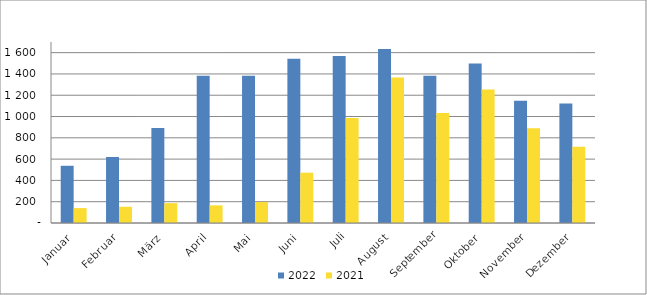
| Category | 2022 | 2021 |
|---|---|---|
| Januar | 537356 | 139890 |
| Februar | 619781 | 152426 |
| März | 891935 | 186676 |
| April | 1382714 | 165722 |
| Mai | 1383660 | 196711 |
| Juni | 1542845 | 472381 |
| Juli | 1568342 | 985615 |
| August | 1634848 | 1365942 |
| September | 1382037 | 1033929 |
| Oktober | 1498661 | 1253815 |
| November | 1147579 | 889861 |
| Dezember | 1121309 | 716232 |